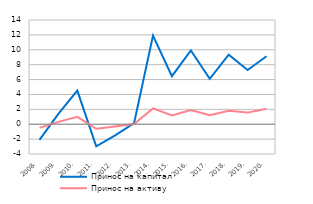
| Category | Принос на капитал | Принос на активу |
|---|---|---|
| 2008. | -2.11 | -0.496 |
| 2009. | 1.39 | 0.32 |
| 2010. | 4.51 | 0.993 |
| 2011. | -2.97 | -0.606 |
| 2012. | -1.5 | -0.3 |
| 2013. | 0.14 | 0.03 |
| 2014. | 11.9 | 2.13 |
| 2015. | 6.45 | 1.18 |
| 2016. | 9.9 | 1.9 |
| 2017. | 6.1 | 1.2 |
| 2018. | 9.34 | 1.8 |
| 2019. | 7.29 | 1.56 |
| 2020. | 9.13 | 2.08 |